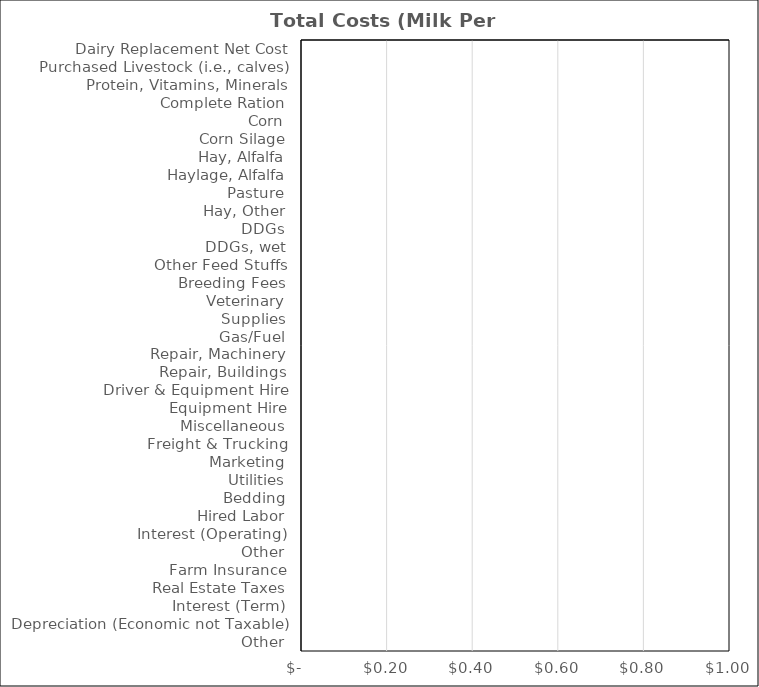
| Category | Milk Per Cwt |
|---|---|
| Dairy Replacement Net Cost | 0 |
| Purchased Livestock (i.e., calves) | 0 |
| Protein, Vitamins, Minerals | 0 |
| Complete Ration | 0 |
| Corn | 0 |
| Corn Silage | 0 |
| Hay, Alfalfa | 0 |
| Haylage, Alfalfa | 0 |
| Pasture | 0 |
| Hay, Other | 0 |
| DDGs | 0 |
| DDGs, wet | 0 |
| Other Feed Stuffs | 0 |
| Breeding Fees | 0 |
| Veterinary | 0 |
| Supplies | 0 |
| Gas/Fuel | 0 |
| Repair, Machinery | 0 |
| Repair, Buildings | 0 |
| Driver & Equipment Hire | 0 |
| Equipment Hire | 0 |
| Miscellaneous | 0 |
| Freight & Trucking | 0 |
| Marketing | 0 |
| Utilities | 0 |
| Bedding | 0 |
| Hired Labor | 0 |
| Interest (Operating) | 0 |
| Other | 0 |
| Farm Insurance | 0 |
| Real Estate Taxes | 0 |
| Interest (Term) | 0 |
| Depreciation (Economic not Taxable) | 0 |
| Other | 0 |